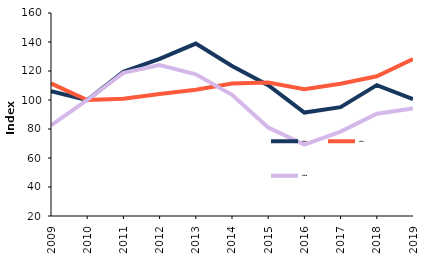
| Category | Series 1 | Series 2 | Series 3 |
|---|---|---|---|
| 2009-01-01 | 106.13 | 111.42 | 82.44 |
| 2010-01-01 | 100 | 100 | 100 |
| 2011-01-01 | 119.5 | 100.87 | 118.7 |
| 2012-01-01 | 128.37 | 104.14 | 124.17 |
| 2013-01-01 | 138.91 | 107.09 | 117.74 |
| 2014-01-01 | 123.42 | 111.4 | 103.6 |
| 2015-01-01 | 110.22 | 112.13 | 81.04 |
| 2016-01-01 | 91.34 | 107.47 | 69.21 |
| 2017-01-01 | 95.04 | 111.24 | 78.18 |
| 2018-01-01 | 110.27 | 116.34 | 90.54 |
| 2019-01-01 | 100.58 | 128.2 | 94.07 |